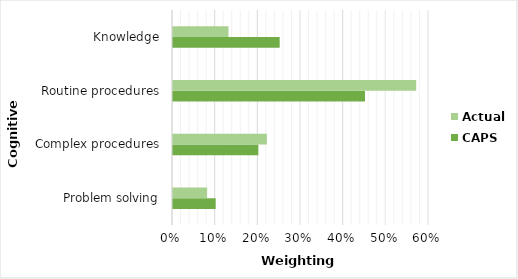
| Category | CAPS | Actual |
|---|---|---|
| Problem solving | 0.1 | 0.08 |
| Complex procedures | 0.2 | 0.22 |
| Routine procedures | 0.45 | 0.57 |
| Knowledge | 0.25 | 0.13 |